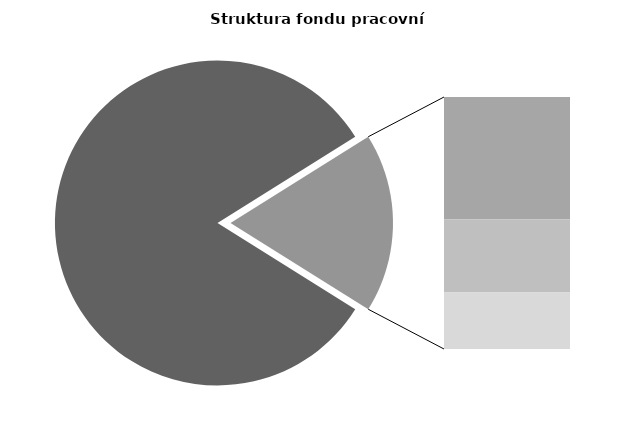
| Category | Series 0 |
|---|---|
| Průměrná měsíční odpracovaná doba bez přesčasu | 138.556 |
| Dovolená | 14.579 |
| Nemoc | 8.722 |
| Jiné | 6.721 |